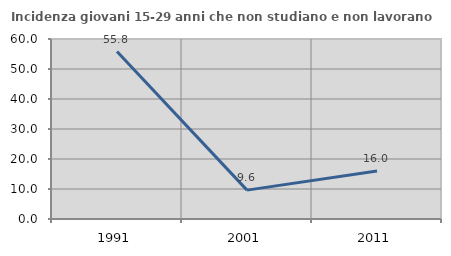
| Category | Incidenza giovani 15-29 anni che non studiano e non lavorano  |
|---|---|
| 1991.0 | 55.818 |
| 2001.0 | 9.626 |
| 2011.0 | 16.019 |